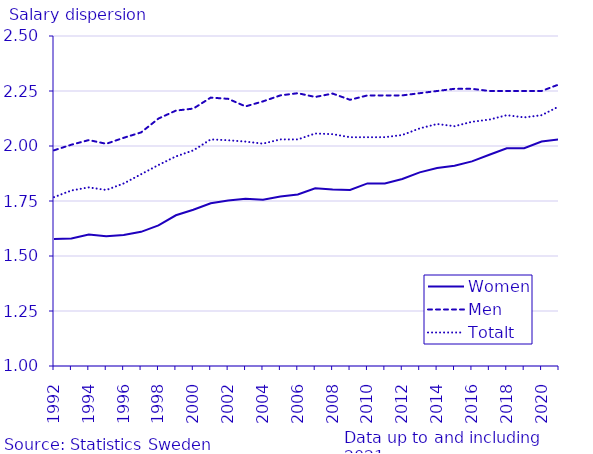
| Category | Women | Men | Totalt |
|---|---|---|---|
| 1992.0 | 1.578 | 1.98 | 1.768 |
| 1993.0 | 1.58 | 2.006 | 1.798 |
| 1994.0 | 1.598 | 2.027 | 1.812 |
| 1995.0 | 1.59 | 2.01 | 1.8 |
| 1996.0 | 1.596 | 2.037 | 1.83 |
| 1997.0 | 1.61 | 2.062 | 1.871 |
| 1998.0 | 1.639 | 2.125 | 1.914 |
| 1999.0 | 1.685 | 2.161 | 1.953 |
| 2000.0 | 1.71 | 2.17 | 1.98 |
| 2001.0 | 1.74 | 2.22 | 2.03 |
| 2002.0 | 1.752 | 2.214 | 2.026 |
| 2003.0 | 1.76 | 2.18 | 2.02 |
| 2004.0 | 1.756 | 2.203 | 2.011 |
| 2005.0 | 1.77 | 2.23 | 2.03 |
| 2006.0 | 1.78 | 2.24 | 2.03 |
| 2007.0 | 1.808 | 2.223 | 2.057 |
| 2008.0 | 1.802 | 2.238 | 2.054 |
| 2009.0 | 1.8 | 2.21 | 2.04 |
| 2010.0 | 1.83 | 2.23 | 2.04 |
| 2011.0 | 1.83 | 2.23 | 2.04 |
| 2012.0 | 1.85 | 2.23 | 2.05 |
| 2013.0 | 1.88 | 2.24 | 2.08 |
| 2014.0 | 1.9 | 2.25 | 2.1 |
| 2015.0 | 1.91 | 2.26 | 2.09 |
| 2016.0 | 1.93 | 2.26 | 2.11 |
| 2017.0 | 1.96 | 2.25 | 2.12 |
| 2018.0 | 1.99 | 2.25 | 2.14 |
| 2019.0 | 1.99 | 2.25 | 2.13 |
| 2020.0 | 2.02 | 2.25 | 2.14 |
| 2021.0 | 2.03 | 2.28 | 2.18 |